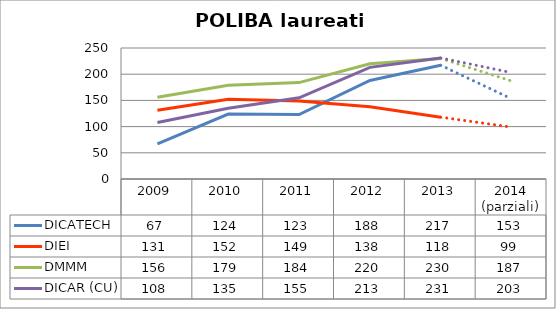
| Category | DICATECH | DIEI  | DMMM | DICAR (CU) |
|---|---|---|---|---|
| 2009 | 67 | 131 | 156 | 108 |
| 2010 | 124 | 152 | 179 | 135 |
| 2011 | 123 | 149 | 184 | 155 |
| 2012 | 188 | 138 | 220 | 213 |
| 2013 | 217 | 118 | 230 | 231 |
| 2014
(parziali) | 153 | 99 | 187 | 203 |